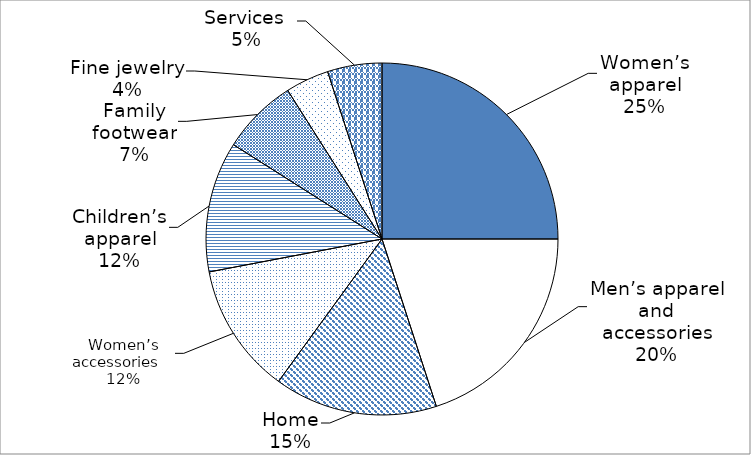
| Category | Series 0 |
|---|---|
| Women’s apparel | 25 |
| Men’s apparel and accessories | 20 |
| Home | 15 |
| Women’s accessories | 12 |
| Children’s apparel | 12 |
| Family footwear | 7 |
| Fine jewelry | 4 |
| Services and other | 5 |